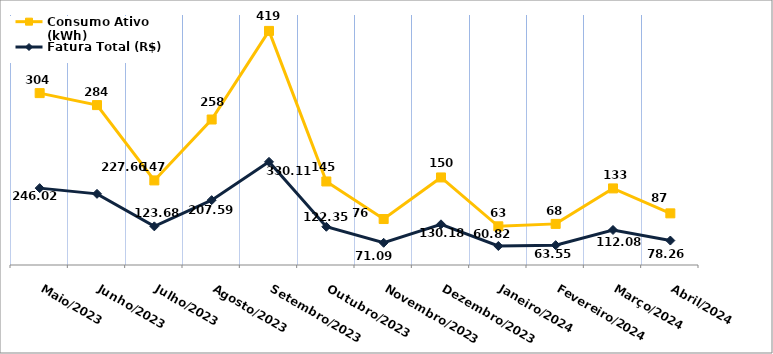
| Category | Fatura Total (R$) | Consumo Ativo (kWh) |
|---|---|---|
| Maio/2023 | 246.02 | 304 |
| Junho/2023 | 227.66 | 284 |
| Julho/2023 | 123.68 | 147 |
| Agosto/2023 | 207.59 | 258 |
| Setembro/2023 | 330.11 | 419 |
| Outubro/2023 | 122.35 | 145 |
| Novembro/2023 | 71.09 | 76 |
| Dezembro/2023 | 130.18 | 150 |
| Janeiro/2024 | 60.82 | 63 |
| Fevereiro/2024 | 63.55 | 68 |
| Março/2024 | 112.08 | 133 |
| Abril/2024 | 78.26 | 87 |